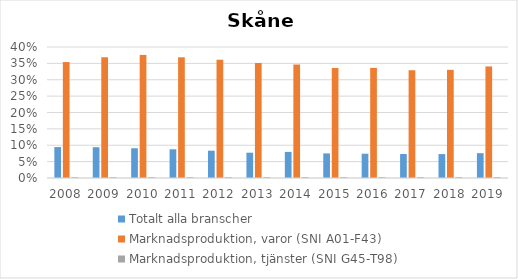
| Category | Totalt alla branscher | Marknadsproduktion, varor (SNI A01-F43) | Marknadsproduktion, tjänster (SNI G45-T98) |
|---|---|---|---|
| 2008 | 0.094 | 0.354 | 0.002 |
| 2009 | 0.094 | 0.369 | 0.002 |
| 2010 | 0.091 | 0.376 | 0.003 |
| 2011 | 0.088 | 0.369 | 0.003 |
| 2012 | 0.083 | 0.361 | 0.003 |
| 2013 | 0.077 | 0.351 | 0.003 |
| 2014 | 0.08 | 0.347 | 0.003 |
| 2015 | 0.075 | 0.336 | 0.003 |
| 2016 | 0.074 | 0.336 | 0.003 |
| 2017 | 0.073 | 0.329 | 0.003 |
| 2018 | 0.073 | 0.33 | 0.003 |
| 2019 | 0.076 | 0.341 | 0.003 |